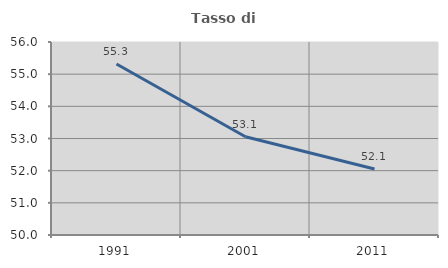
| Category | Tasso di occupazione   |
|---|---|
| 1991.0 | 55.314 |
| 2001.0 | 53.056 |
| 2011.0 | 52.053 |